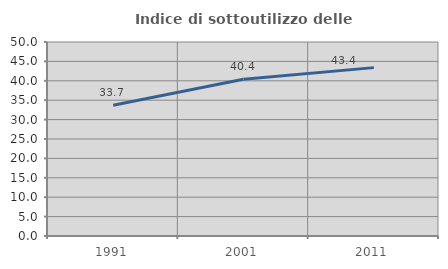
| Category | Indice di sottoutilizzo delle abitazioni  |
|---|---|
| 1991.0 | 33.721 |
| 2001.0 | 40.388 |
| 2011.0 | 43.396 |